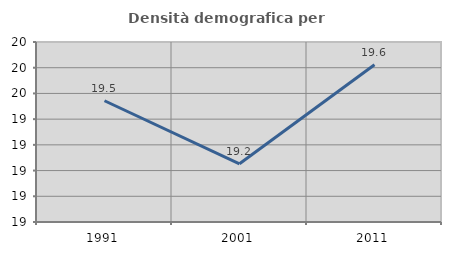
| Category | Densità demografica |
|---|---|
| 1991.0 | 19.471 |
| 2001.0 | 19.226 |
| 2011.0 | 19.612 |